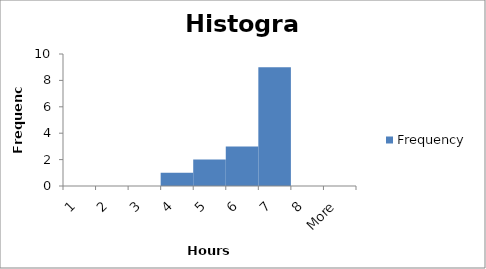
| Category | Frequency |
|---|---|
| 1 | 0 |
| 2 | 0 |
| 3 | 0 |
| 4 | 1 |
| 5 | 2 |
| 6 | 3 |
| 7 | 9 |
| 8 | 0 |
| More | 0 |